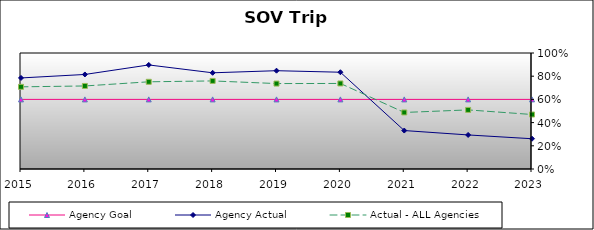
| Category | Agency Goal | Agency Actual | Actual - ALL Agencies |
|---|---|---|---|
| 2015.0 | 0.6 | 0.785 | 0.708 |
| 2016.0 | 0.6 | 0.815 | 0.716 |
| 2017.0 | 0.6 | 0.897 | 0.752 |
| 2018.0 | 0.6 | 0.829 | 0.759 |
| 2019.0 | 0.6 | 0.848 | 0.736 |
| 2020.0 | 0.6 | 0.834 | 0.737 |
| 2021.0 | 0.6 | 0.331 | 0.487 |
| 2022.0 | 0.6 | 0.294 | 0.509 |
| 2023.0 | 0.6 | 0.261 | 0.47 |